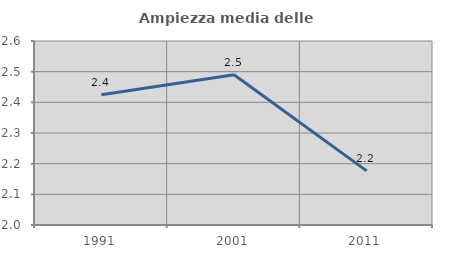
| Category | Ampiezza media delle famiglie |
|---|---|
| 1991.0 | 2.425 |
| 2001.0 | 2.49 |
| 2011.0 | 2.177 |